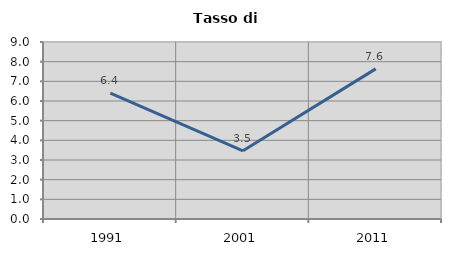
| Category | Tasso di disoccupazione   |
|---|---|
| 1991.0 | 6.407 |
| 2001.0 | 3.47 |
| 2011.0 | 7.634 |